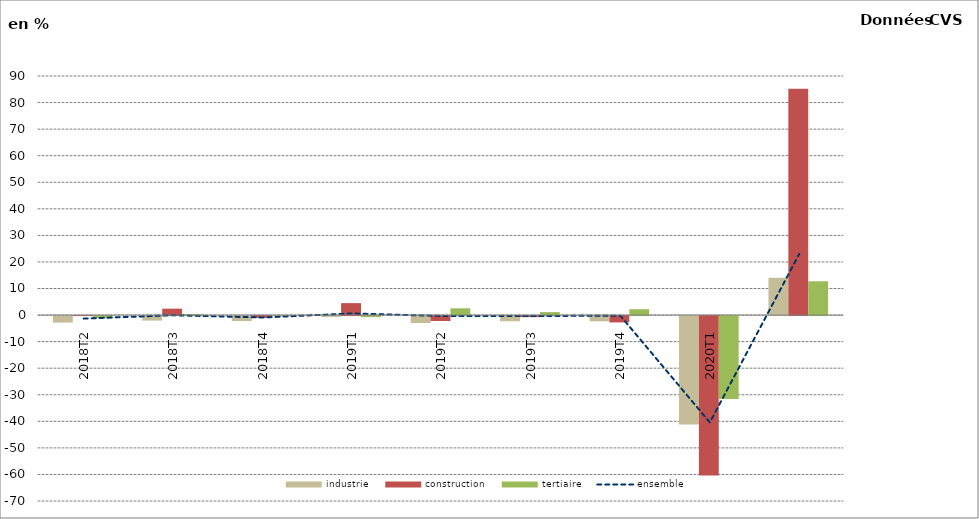
| Category | industrie | construction | tertiaire |
|---|---|---|---|
| 2018T2 | -2.468 | 0.001 | -0.877 |
| 2018T3 | -1.711 | 2.407 | 0.344 |
| 2018T4 | -1.884 | -0.694 | -0.1 |
| 2019T1 | -0.321 | 4.492 | -0.39 |
| 2019T2 | -2.609 | -1.85 | 2.538 |
| 2019T3 | -1.955 | -0.406 | 1.128 |
| 2019T4 | -1.98 | -2.392 | 2.204 |
| 2020T1 | -40.855 | -59.987 | -31.219 |